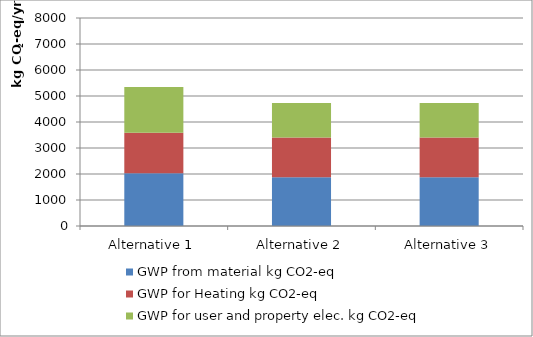
| Category | GWP from material kg CO2-eq | GWP for Heating kg CO2-eq | GWP for user and property elec. kg CO2-eq |
|---|---|---|---|
| Alternative 1 | 2032.566 | 1551.38 | 1766.39 |
| Alternative 2 | 1875.356 | 1527.566 | 1324.792 |
| Alternative 3 | 1875.356 | 1527.566 | 1324.792 |